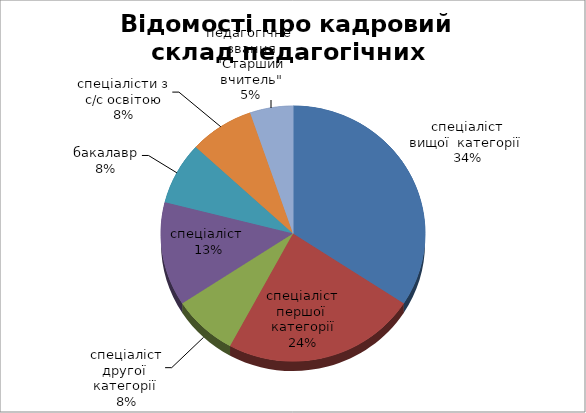
| Category | Series 0 |
|---|---|
| спеціаліст вищої  категорії  | 13 |
| спеціаліст першої  категорії | 9 |
| спеціаліст другої  категорії  | 3 |
| спеціаліст  | 5 |
| бакалавр | 3 |
| спеціалісти з с/с освітою | 3 |
| педагогічне  звання "Старший вчитель" | 2 |